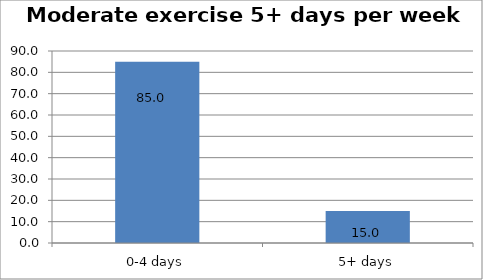
| Category | Series 0 |
|---|---|
| 0-4 days | 84.961 |
| 5+ days | 15.039 |